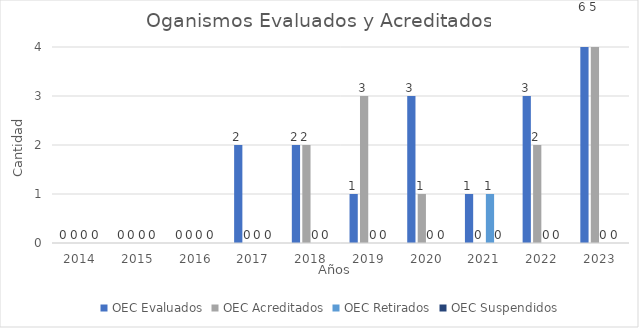
| Category | OEC Evaluados | OEC Acreditados | OEC Retirados | OEC Suspendidos |
|---|---|---|---|---|
| 2014.0 | 0 | 0 | 0 | 0 |
| 2015.0 | 0 | 0 | 0 | 0 |
| 2016.0 | 0 | 0 | 0 | 0 |
| 2017.0 | 2 | 0 | 0 | 0 |
| 2018.0 | 2 | 2 | 0 | 0 |
| 2019.0 | 1 | 3 | 0 | 0 |
| 2020.0 | 3 | 1 | 0 | 0 |
| 2021.0 | 1 | 0 | 1 | 0 |
| 2022.0 | 3 | 2 | 0 | 0 |
| 2023.0 | 6 | 5 | 0 | 0 |